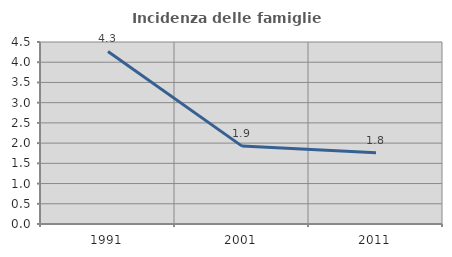
| Category | Incidenza delle famiglie numerose |
|---|---|
| 1991.0 | 4.267 |
| 2001.0 | 1.926 |
| 2011.0 | 1.759 |